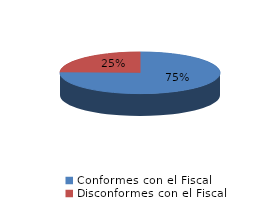
| Category | Series 0 |
|---|---|
| 0 | 58 |
| 1 | 19 |